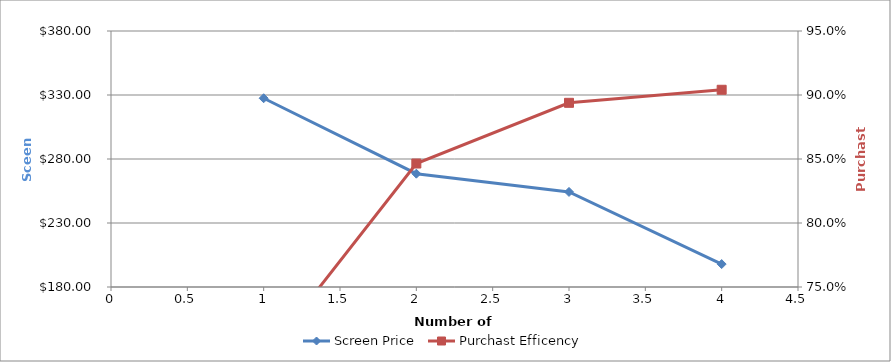
| Category | Screen Price |
|---|---|
| 1.0 | 327.472 |
| 2.0 | 268.526 |
| 3.0 | 254.277 |
| 4.0 | 197.907 |